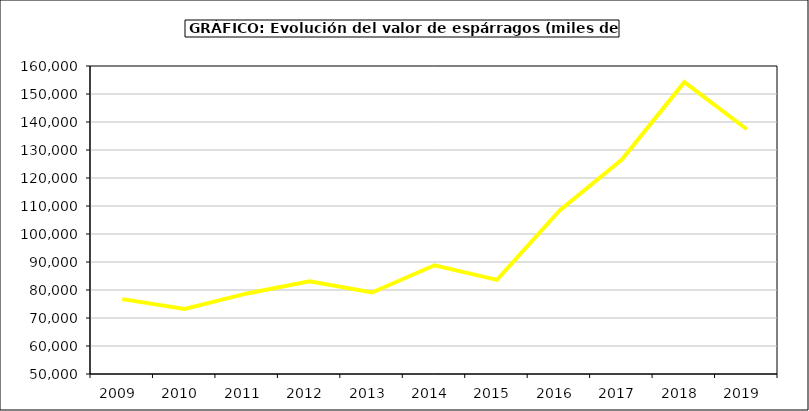
| Category | Valor |
|---|---|
| 2009.0 | 76743.638 |
| 2010.0 | 73215.082 |
| 2011.0 | 78781.277 |
| 2012.0 | 83128.666 |
| 2013.0 | 79103.985 |
| 2014.0 | 88833.6 |
| 2015.0 | 83613.501 |
| 2016.0 | 108300 |
| 2017.0 | 126575 |
| 2018.0 | 154241.925 |
| 2019.0 | 137405.283 |